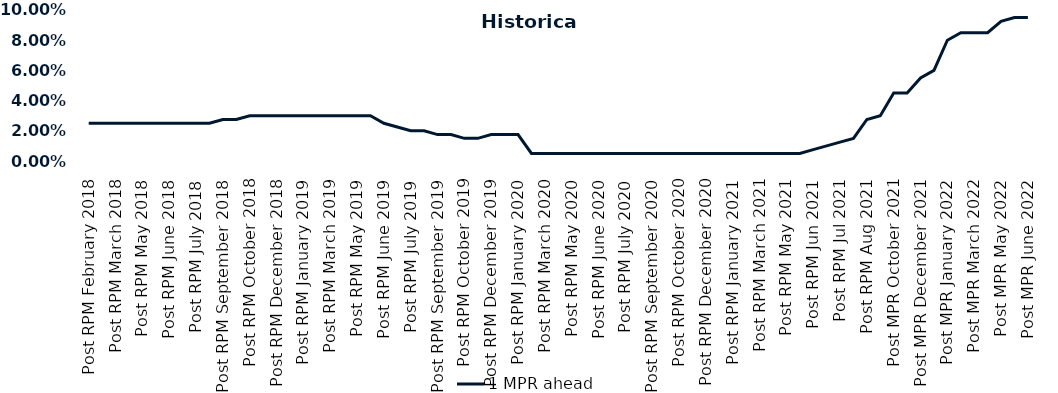
| Category | 1 MPR ahead |
|---|---|
| Post RPM February 2018 | 0.025 |
| Pre RPM March 2018 | 0.025 |
| Post RPM March 2018 | 0.025 |
| Pre RPM May 2018 | 0.025 |
| Post RPM May 2018 | 0.025 |
| Pre RPM June 2018 | 0.025 |
| Post RPM June 2018 | 0.025 |
| Pre RPM July 2018 | 0.025 |
| Post RPM July 2018 | 0.025 |
| Pre RPM September 2018 | 0.025 |
| Post RPM September 2018 | 0.028 |
| Pre RPM October 2018 | 0.028 |
| Post RPM October 2018 | 0.03 |
| Pre RPM December 2018 | 0.03 |
| Post RPM December 2018 | 0.03 |
| Pre RPM January 2019 | 0.03 |
| Post RPM January 2019 | 0.03 |
| Pre RPM March 2019 | 0.03 |
| Post RPM March 2019 | 0.03 |
| Pre RPM May 2019 | 0.03 |
| Post RPM May 2019 | 0.03 |
| Pre RPM June 2019 | 0.03 |
| Post RPM June 2019 | 0.025 |
| Pre RPM July 2019 | 0.022 |
| Post RPM July 2019 | 0.02 |
| Pre RPM September 2019 | 0.02 |
| Post RPM September 2019 | 0.018 |
| Pre RPM October 2019 | 0.018 |
| Post RPM October 2019 | 0.015 |
| Pre RPM December 2019 | 0.015 |
| Post RPM December 2019 | 0.018 |
| Pre RPM January 2020 | 0.018 |
| Post RPM January 2020 | 0.018 |
| Pre RPM March 2020 | 0.005 |
| Post RPM March 2020 | 0.005 |
| Pre RPM May 2020 | 0.005 |
| Post RPM May 2020 | 0.005 |
| Pre RPM June 2020 | 0.005 |
| Post RPM June 2020 | 0.005 |
| Pre RPM July 2020 | 0.005 |
| Post RPM July 2020 | 0.005 |
| Pre RPM September 2020 | 0.005 |
| Post RPM September 2020 | 0.005 |
| Pre RPM October 2020 | 0.005 |
| Post RPM October 2020 | 0.005 |
| Pre RPM December 2020 | 0.005 |
|  Post RPM December 2020 | 0.005 |
| Pre RPM January 2021 | 0.005 |
| Post RPM January 2021 | 0.005 |
|  Pre RPM March 2021 | 0.005 |
|  Post RPM March 2021 | 0.005 |
|  Pre RPM May 2021 | 0.005 |
|  Post RPM May 2021 | 0.005 |
|  Pre RPM Jun 2021 | 0.005 |
|   Post RPM Jun 2021 | 0.008 |
| Pre RPM Jul 2021 | 0.01 |
|  Post RPM Jul 2021 | 0.012 |
| Pre RPM Aug 2021 | 0.015 |
|  Post RPM Aug 2021 | 0.028 |
| Pre MPR October 2021 | 0.03 |
| Post MPR October 2021 | 0.045 |
| Pre MPR December 2021 | 0.045 |
| Post MPR December 2021 | 0.055 |
| Pre MPR January 2022 | 0.06 |
| Post MPR January 2022 | 0.08 |
| Pre MPR March 2022 | 0.085 |
| Post MPR March 2022 | 0.085 |
| Pre MPR May 2022 | 0.085 |
| Post MPR May 2022 | 0.092 |
| Pre MPR June 2022 | 0.095 |
| Post MPR June 2022 | 0.095 |